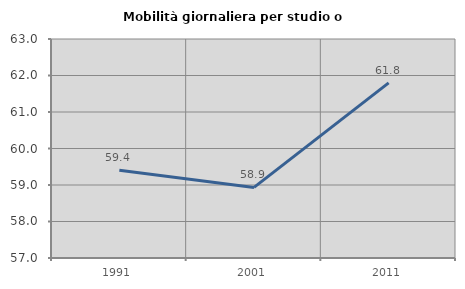
| Category | Mobilità giornaliera per studio o lavoro |
|---|---|
| 1991.0 | 59.407 |
| 2001.0 | 58.934 |
| 2011.0 | 61.797 |